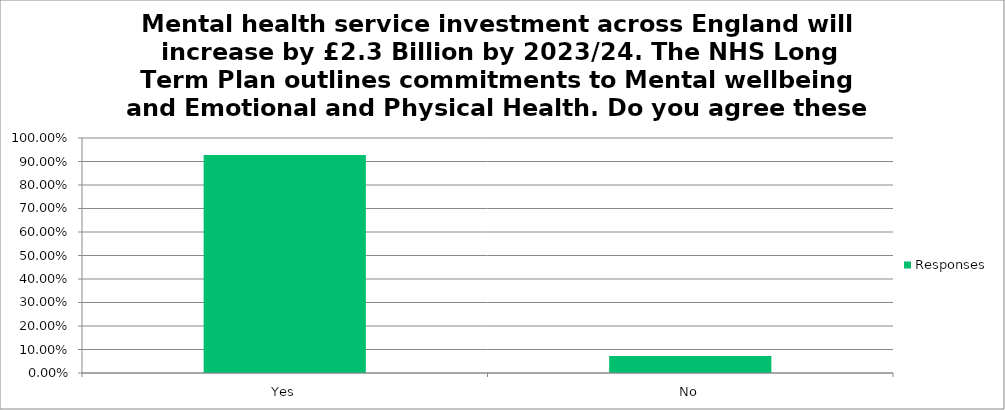
| Category | Responses |
|---|---|
| Yes | 0.928 |
| No | 0.072 |